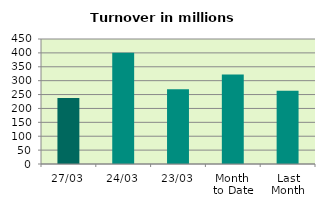
| Category | Series 0 |
|---|---|
| 27/03 | 237.802 |
| 24/03 | 400.944 |
| 23/03 | 268.999 |
| Month 
to Date | 322.251 |
| Last
Month | 263.32 |